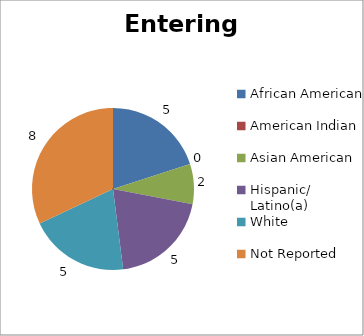
| Category | Entering Military |
|---|---|
| African American | 5 |
| American Indian | 0 |
| Asian American | 2 |
| Hispanic/ Latino(a) | 5 |
| White | 5 |
| Not Reported | 8 |